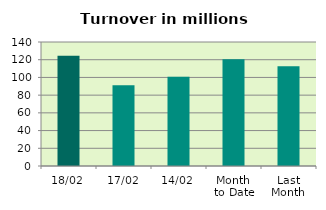
| Category | Series 0 |
|---|---|
| 18/02 | 124.445 |
| 17/02 | 91.265 |
| 14/02 | 100.651 |
| Month 
to Date | 120.414 |
| Last
Month | 112.571 |